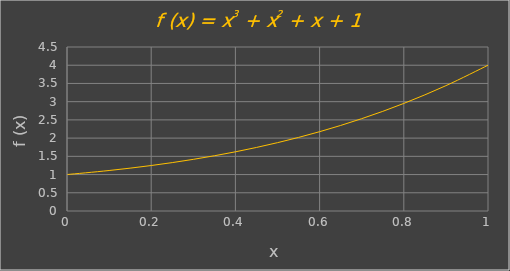
| Category | f (x) |
|---|---|
| 0.0 | 1 |
| 0.1 | 1.111 |
| 0.2 | 1.248 |
| 0.3 | 1.417 |
| 0.4 | 1.624 |
| 0.5 | 1.875 |
| 0.6 | 2.176 |
| 0.7 | 2.533 |
| 0.8 | 2.952 |
| 0.9 | 3.439 |
| 1.0 | 4 |